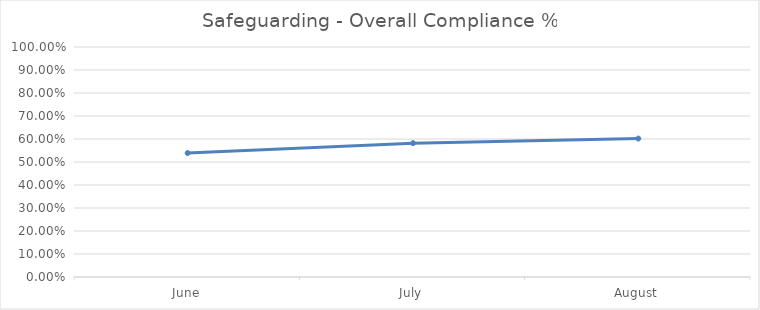
| Category | Safeguarding - Overall Compliance % |
|---|---|
| June | 0.539 |
| July | 0.582 |
| August | 0.602 |